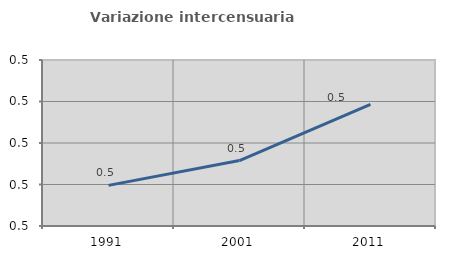
| Category | Variazione intercensuaria annua |
|---|---|
| 1991.0 | 0.505 |
| 2001.0 | 0.508 |
| 2011.0 | 0.515 |